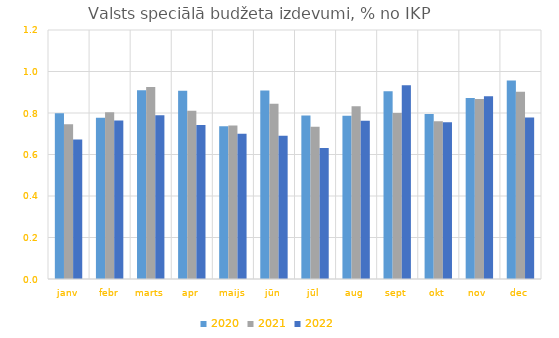
| Category | 2020 | 2021 | 2022 |
|---|---|---|---|
| janv | 0.799 | 0.746 | 0.673 |
| febr | 0.777 | 0.804 | 0.764 |
| marts | 0.91 | 0.926 | 0.79 |
| apr | 0.908 | 0.81 | 0.743 |
| maijs | 0.736 | 0.74 | 0.7 |
| jūn | 0.909 | 0.845 | 0.691 |
| jūl | 0.787 | 0.733 | 0.631 |
| aug | 0.786 | 0.832 | 0.763 |
| sept | 0.904 | 0.8 | 0.934 |
| okt | 0.795 | 0.76 | 0.756 |
| nov | 0.873 | 0.867 | 0.881 |
| dec | 0.957 | 0.903 | 0.778 |